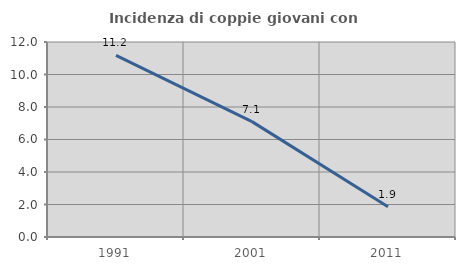
| Category | Incidenza di coppie giovani con figli |
|---|---|
| 1991.0 | 11.178 |
| 2001.0 | 7.099 |
| 2011.0 | 1.859 |